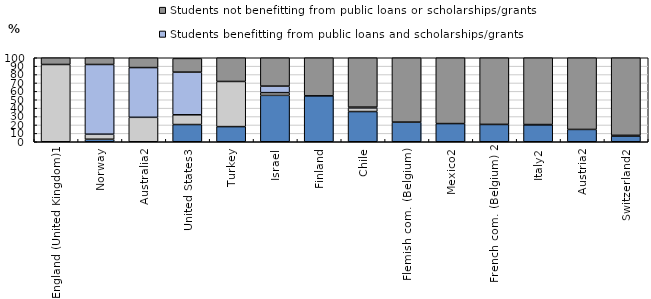
| Category | Students benefitting from scholarships/grants 
only | Students benefitting from public loans 
only | Students benefitting from public loans and scholarships/grants | Students not benefitting from public loans or scholarships/grants |
|---|---|---|---|---|
| England (United Kingdom)1 | 0 | 92 | 0 | 8 |
| Norway | 3 | 6 | 83 | 8 |
| Australia2 | 0 | 29.083 | 59.232 | 11.684 |
| United States3 | 20.493 | 11.596 | 50.792 | 16.331 |
| Turkey | 18.035 | 53.746 | 0 | 28.219 |
| Israel | 55.249 | 3.214 | 7.773 | 33.764 |
| Finland | 54.638 | 0 | 0 | 45.362 |
| Chile | 35.957 | 4.343 | 0.911 | 58.789 |
| Flemish com. (Belgium)  | 23.396 | 0 | 0 | 76.604 |
| Mexico2 | 21.637 | 0 | 0 | 78.363 |
| French com. (Belgium) 2 | 20.7 | 0 | 0.002 | 79.297 |
| Italy2 | 20.237 | 0.252 | 0 | 79.511 |
| Austria2 | 14.67 | 0 | 0 | 85.33 |
| Switzerland2 | 6.969 | 0.186 | 0.483 | 92.362 |